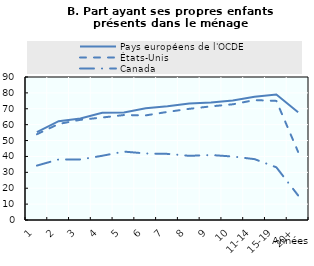
| Category | Pays européens de l'OCDE | États-Unis | Canada |
|---|---|---|---|
| 1 | 55.291 | 53.98 | 34.238 |
| 2 | 62.202 | 60.446 | 38.112 |
| 3 | 63.877 | 63.056 | 38.117 |
| 4 | 67.513 | 64.493 | 40.426 |
| 5 | 67.596 | 66.062 | 43.053 |
| 6 | 70.297 | 65.835 | 41.87 |
| 7 | 71.552 | 68.039 | 41.611 |
| 8 | 73.364 | 69.972 | 40.378 |
| 9 | 73.924 | 71.521 | 40.896 |
| 10 | 75.263 | 72.814 | 39.951 |
| 11-14 | 77.625 | 75.466 | 38.302 |
| 15-19 | 78.928 | 74.957 | 33.17 |
| 20+ | 67.76 | 42.862 | 15.473 |